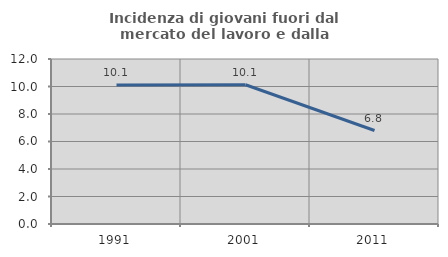
| Category | Incidenza di giovani fuori dal mercato del lavoro e dalla formazione  |
|---|---|
| 1991.0 | 10.103 |
| 2001.0 | 10.13 |
| 2011.0 | 6.8 |